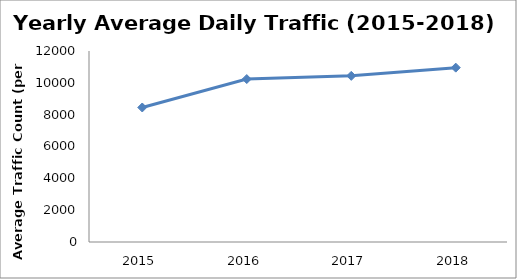
| Category | Series 0 |
|---|---|
| 2015.0 | 8450.825 |
| 2016.0 | 10237.221 |
| 2017.0 | 10438.211 |
| 2018.0 | 10953.871 |